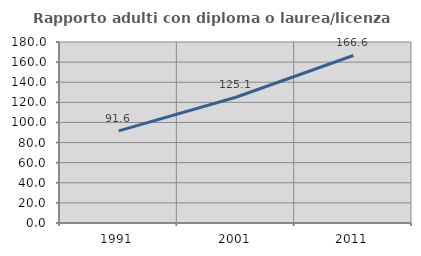
| Category | Rapporto adulti con diploma o laurea/licenza media  |
|---|---|
| 1991.0 | 91.567 |
| 2001.0 | 125.064 |
| 2011.0 | 166.591 |